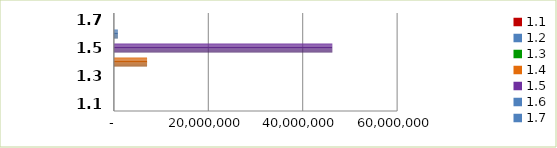
| Category | Series 0 |
|---|---|
| 1.1 | 0 |
| 1.2 | 0 |
| 1.3 | 0 |
| 1.4 | 7036410 |
| 1.5 | 46272501 |
| 1.6 | 847512 |
| 1.7 | 0 |